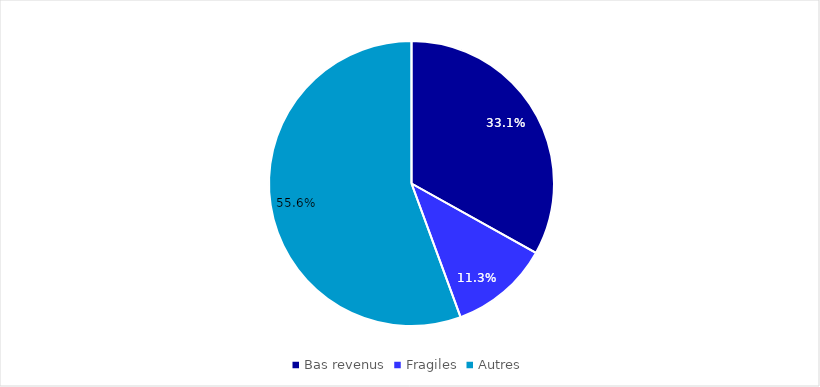
| Category | Series 0 |
|---|---|
| Bas revenus  | 0.331 |
| Fragiles  | 0.113 |
| Autres | 0.556 |